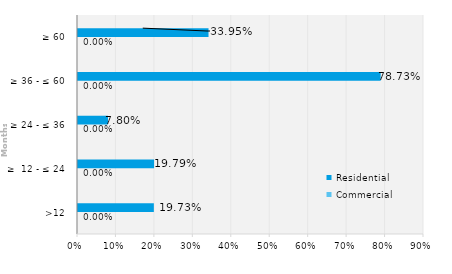
| Category | Commercial | Residential |
|---|---|---|
| >12 | 0 | 0.197 |
| ≥  12 - ≤ 24 | 0 | 0.198 |
| ≥ 24 - ≤ 36 | 0 | 0.078 |
| ≥ 36 - ≤ 60 | 0 | 0.787 |
| ≥ 60 | 0 | 0.34 |